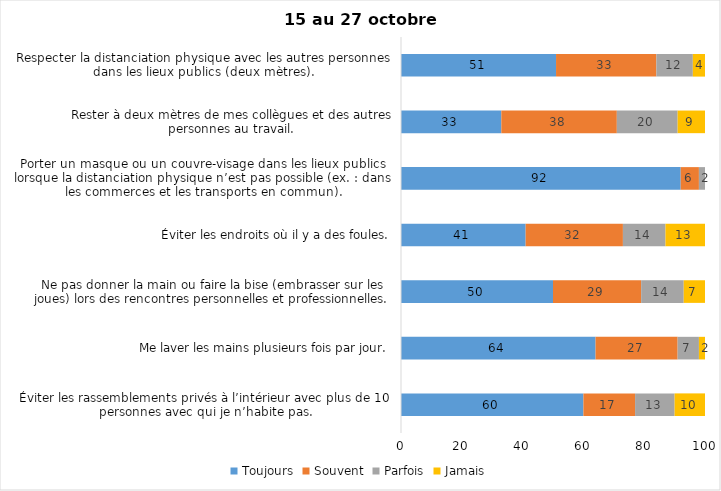
| Category | Toujours | Souvent | Parfois | Jamais |
|---|---|---|---|---|
| Éviter les rassemblements privés à l’intérieur avec plus de 10 personnes avec qui je n’habite pas. | 60 | 17 | 13 | 10 |
| Me laver les mains plusieurs fois par jour. | 64 | 27 | 7 | 2 |
| Ne pas donner la main ou faire la bise (embrasser sur les joues) lors des rencontres personnelles et professionnelles. | 50 | 29 | 14 | 7 |
| Éviter les endroits où il y a des foules. | 41 | 32 | 14 | 13 |
| Porter un masque ou un couvre-visage dans les lieux publics lorsque la distanciation physique n’est pas possible (ex. : dans les commerces et les transports en commun). | 92 | 6 | 2 | 0 |
| Rester à deux mètres de mes collègues et des autres personnes au travail. | 33 | 38 | 20 | 9 |
| Respecter la distanciation physique avec les autres personnes dans les lieux publics (deux mètres). | 51 | 33 | 12 | 4 |